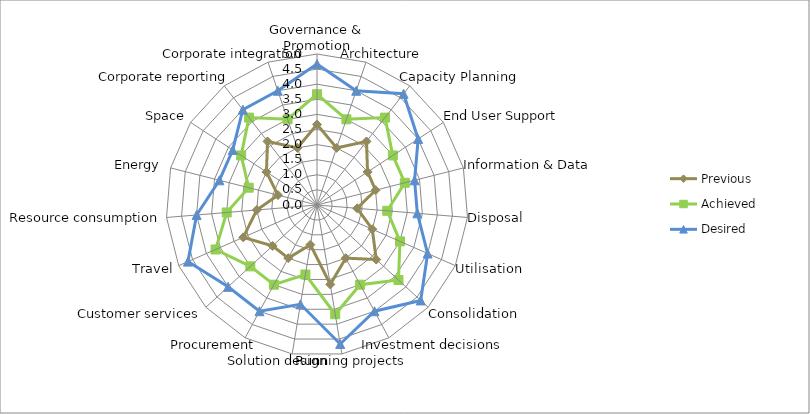
| Category | Previous | Achieved | Desired |
|---|---|---|---|
| Governance & Promotion | 2.667 | 3.667 | 4.667 |
| Architecture | 2 | 3 | 4 |
| Capacity Planning | 2.667 | 3.667 | 4.667 |
| End User Support | 2 | 3 | 4 |
| Information & Data | 2 | 3 | 3.333 |
| Disposal | 1.333 | 2.333 | 3.333 |
| Utilisation | 2 | 3 | 4 |
| Consolidation | 2.667 | 3.667 | 4.667 |
| Investment decisions | 2 | 3 | 4 |
| Running projects | 2.667 | 3.667 | 4.667 |
| Solution design | 1.333 | 2.333 | 3.333 |
| Procurement | 2 | 3 | 4 |
| Customer services | 2 | 3 | 4 |
| Travel | 2.667 | 3.667 | 4.667 |
| Resource consumption | 2 | 3 | 4 |
| Energy  | 1.333 | 2.333 | 3.333 |
| Space | 2 | 3 | 3.333 |
| Corporate reporting | 2.667 | 3.667 | 4 |
| Corporate integration | 2 | 3 | 4 |